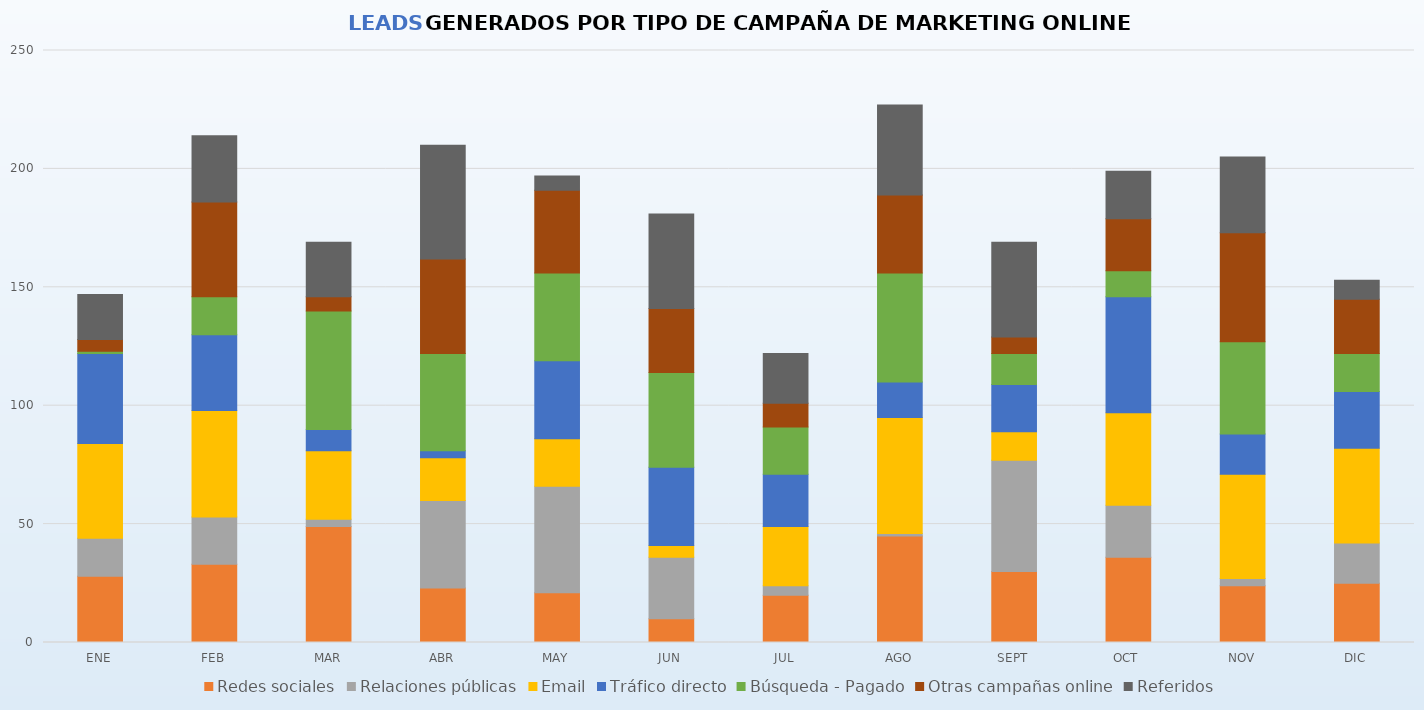
| Category | Redes sociales | Relaciones públicas | Email | Tráfico directo | Búsqueda - Pagado | Otras campañas online | Referidos |
|---|---|---|---|---|---|---|---|
| ENE | 28 | 16 | 40 | 38 | 1 | 5 | 19 |
| FEB | 33 | 20 | 45 | 32 | 16 | 40 | 28 |
| MAR | 49 | 3 | 29 | 9 | 50 | 6 | 23 |
| ABR | 23 | 37 | 18 | 3 | 41 | 40 | 48 |
| MAY | 21 | 45 | 20 | 33 | 37 | 35 | 6 |
| JUN | 10 | 26 | 5 | 33 | 40 | 27 | 40 |
| JUL | 20 | 4 | 25 | 22 | 20 | 10 | 21 |
| AGO | 45 | 1 | 49 | 15 | 46 | 33 | 38 |
| SEPT | 30 | 47 | 12 | 20 | 13 | 7 | 40 |
| OCT | 36 | 22 | 39 | 49 | 11 | 22 | 20 |
| NOV | 24 | 3 | 44 | 17 | 39 | 46 | 32 |
| DIC | 25 | 17 | 40 | 24 | 16 | 23 | 8 |